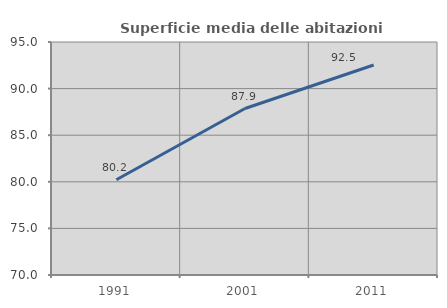
| Category | Superficie media delle abitazioni occupate |
|---|---|
| 1991.0 | 80.215 |
| 2001.0 | 87.86 |
| 2011.0 | 92.53 |